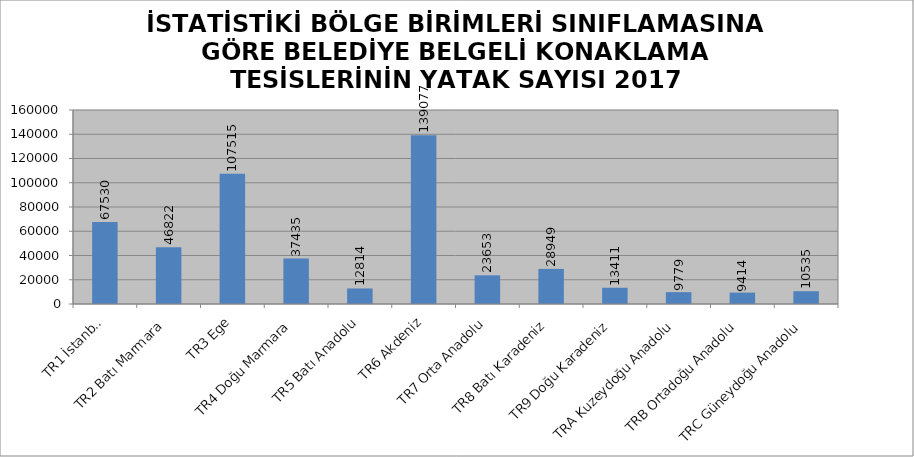
| Category | BELEDİYE BELGELİ TESİSLER |
|---|---|
| TR1 İstanbul | 67530 |
| TR2 Batı Marmara | 46822 |
| TR3 Ege | 107515 |
| TR4 Doğu Marmara | 37435 |
| TR5 Batı Anadolu | 12814 |
| TR6 Akdeniz | 139077 |
| TR7 Orta Anadolu | 23653 |
| TR8 Batı Karadeniz | 28949 |
| TR9 Doğu Karadeniz | 13411 |
| TRA Kuzeydoğu Anadolu | 9779 |
| TRB Ortadoğu Anadolu | 9414 |
| TRC Güneydoğu Anadolu | 10535 |